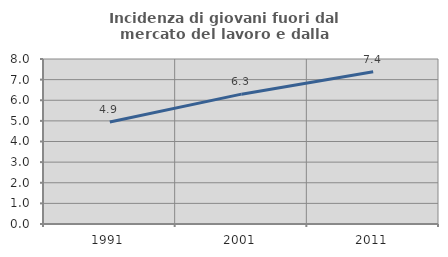
| Category | Incidenza di giovani fuori dal mercato del lavoro e dalla formazione  |
|---|---|
| 1991.0 | 4.941 |
| 2001.0 | 6.296 |
| 2011.0 | 7.378 |